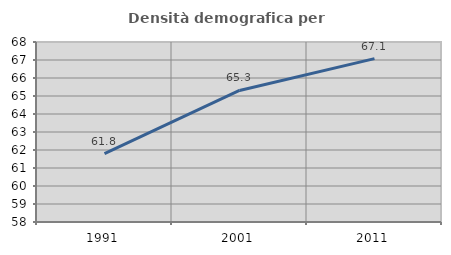
| Category | Densità demografica |
|---|---|
| 1991.0 | 61.796 |
| 2001.0 | 65.309 |
| 2011.0 | 67.078 |